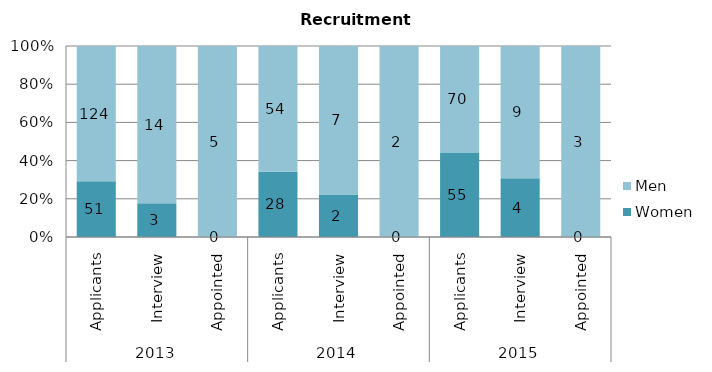
| Category | Women | Men |
|---|---|---|
| 0 | 51 | 124 |
| 1 | 3 | 14 |
| 2 | 0 | 5 |
| 3 | 28 | 54 |
| 4 | 2 | 7 |
| 5 | 0 | 2 |
| 6 | 55 | 70 |
| 7 | 4 | 9 |
| 8 | 0 | 3 |